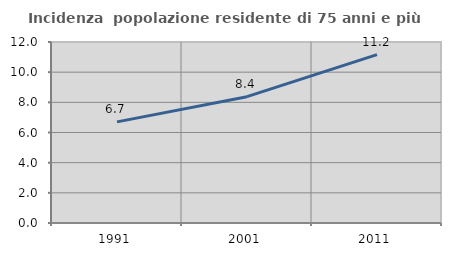
| Category | Incidenza  popolazione residente di 75 anni e più |
|---|---|
| 1991.0 | 6.704 |
| 2001.0 | 8.376 |
| 2011.0 | 11.167 |